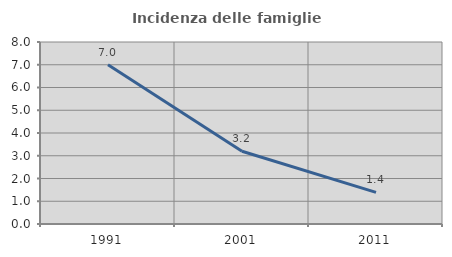
| Category | Incidenza delle famiglie numerose |
|---|---|
| 1991.0 | 7.001 |
| 2001.0 | 3.198 |
| 2011.0 | 1.391 |